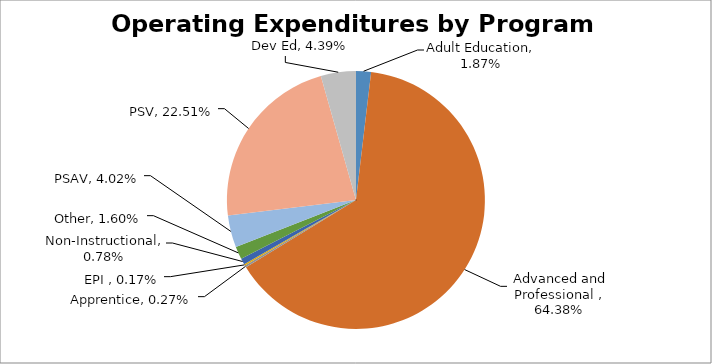
| Category | Series 0 |
|---|---|
| Adult Education | 0.019 |
| Advanced and Professional | 0.644 |
| Apprentice | 0.003 |
| EPI | 0.002 |
| Non-Instructional | 0.008 |
| Other | 0.016 |
| PSAV | 0.04 |
| PSV | 0.225 |
| Dev Ed | 0.044 |